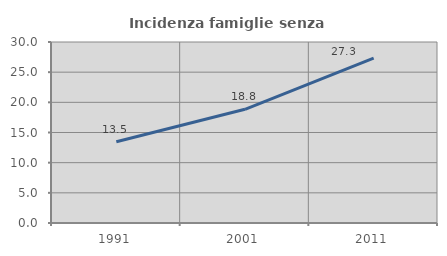
| Category | Incidenza famiglie senza nuclei |
|---|---|
| 1991.0 | 13.454 |
| 2001.0 | 18.849 |
| 2011.0 | 27.342 |